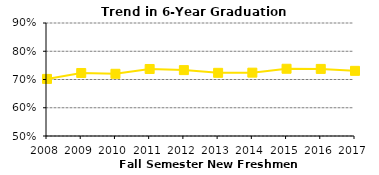
| Category | Series 1 |
|---|---|
| 2008.0 | 0.702 |
| 2009.0 | 0.723 |
| 2010.0 | 0.72 |
| 2011.0 | 0.737 |
| 2012.0 | 0.733 |
| 2013.0 | 0.724 |
| 2014.0 | 0.724 |
| 2015.0 | 0.738 |
| 2016.0 | 0.737 |
| 2017.0 | 0.731 |